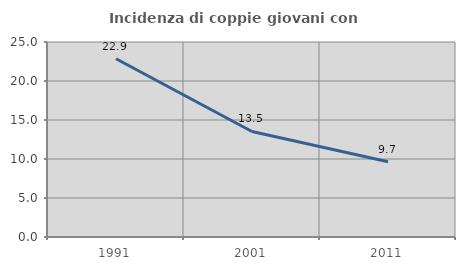
| Category | Incidenza di coppie giovani con figli |
|---|---|
| 1991.0 | 22.855 |
| 2001.0 | 13.532 |
| 2011.0 | 9.653 |